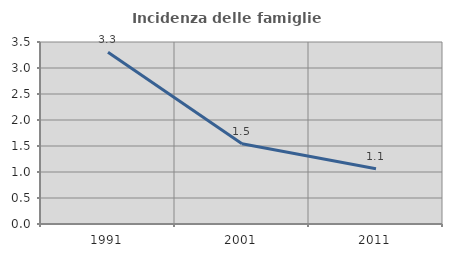
| Category | Incidenza delle famiglie numerose |
|---|---|
| 1991.0 | 3.302 |
| 2001.0 | 1.542 |
| 2011.0 | 1.062 |